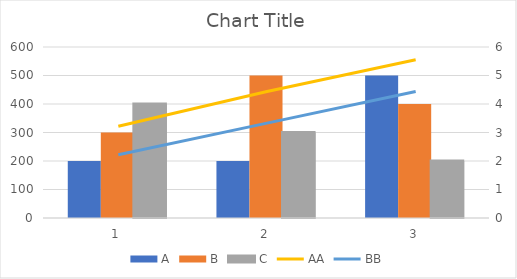
| Category | A | B | C |
|---|---|---|---|
| 0 | 2 | 3 | 4 |
| 1 | 2 | 5 | 3 |
| 2 | 5 | 4 | 2 |